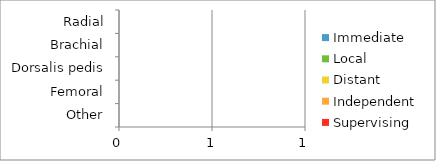
| Category | Immediate | Local | Distant | Independent | Supervising |
|---|---|---|---|---|---|
| Radial | 0 | 0 | 0 | 0 | 0 |
| Brachial | 0 | 0 | 0 | 0 | 0 |
| Dorsalis pedis | 0 | 0 | 0 | 0 | 0 |
| Femoral | 0 | 0 | 0 | 0 | 0 |
| Other | 0 | 0 | 0 | 0 | 0 |